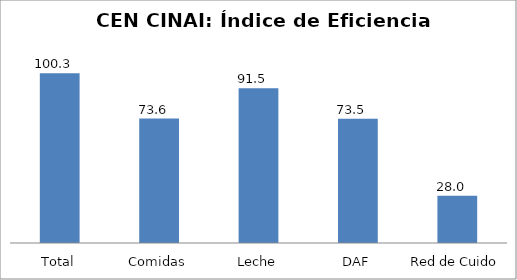
| Category | Índice de eficiencia (IE)  |
|---|---|
| Total | 100.308 |
| Comidas | 73.558 |
| Leche | 91.549 |
| DAF | 73.471 |
| Red de Cuido | 28 |